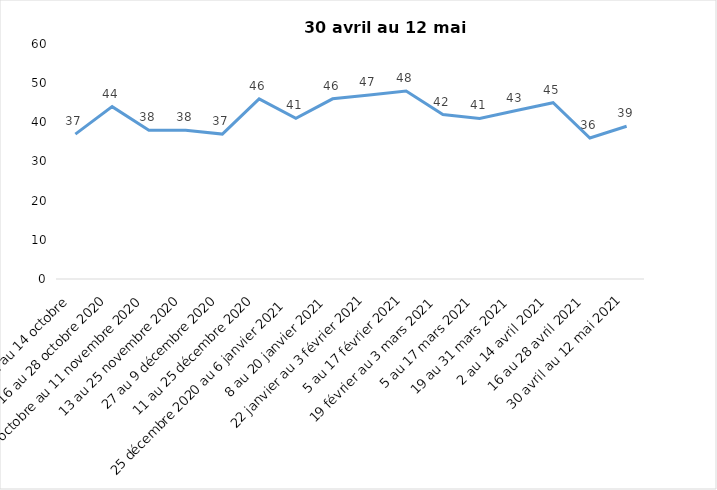
| Category | Toujours aux trois mesures |
|---|---|
| 2 au 14 octobre  | 37 |
| 16 au 28 octobre 2020 | 44 |
| 30 octobre au 11 novembre 2020 | 38 |
| 13 au 25 novembre 2020 | 38 |
| 27 au 9 décembre 2020 | 37 |
| 11 au 25 décembre 2020 | 46 |
| 25 décembre 2020 au 6 janvier 2021 | 41 |
| 8 au 20 janvier 2021 | 46 |
| 22 janvier au 3 février 2021 | 47 |
| 5 au 17 février 2021 | 48 |
| 19 février au 3 mars 2021 | 42 |
| 5 au 17 mars 2021 | 41 |
| 19 au 31 mars 2021 | 43 |
| 2 au 14 avril 2021 | 45 |
| 16 au 28 avril 2021 | 36 |
| 30 avril au 12 mai 2021 | 39 |